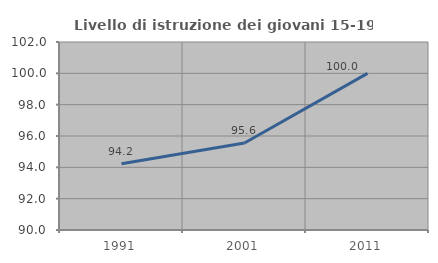
| Category | Livello di istruzione dei giovani 15-19 anni |
|---|---|
| 1991.0 | 94.231 |
| 2001.0 | 95.556 |
| 2011.0 | 100 |